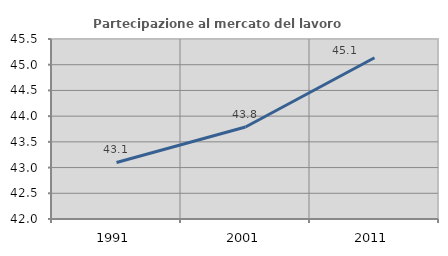
| Category | Partecipazione al mercato del lavoro  femminile |
|---|---|
| 1991.0 | 43.1 |
| 2001.0 | 43.788 |
| 2011.0 | 45.135 |